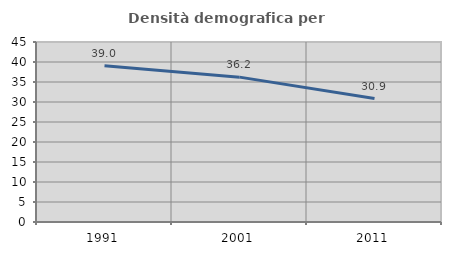
| Category | Densità demografica |
|---|---|
| 1991.0 | 39.047 |
| 2001.0 | 36.217 |
| 2011.0 | 30.87 |